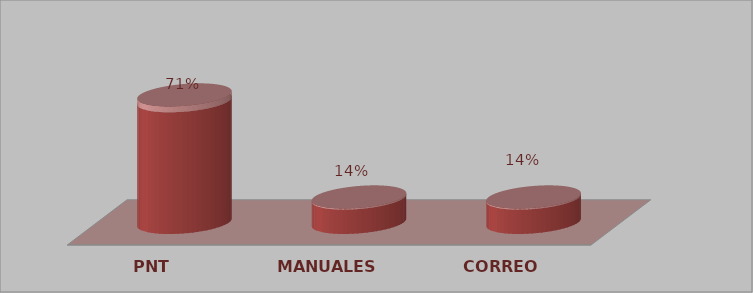
| Category | Series 0 | Series 1 |
|---|---|---|
| PNT | 15 | 0.714 |
| MANUALES | 3 | 0.143 |
| CORREO | 3 | 0.143 |